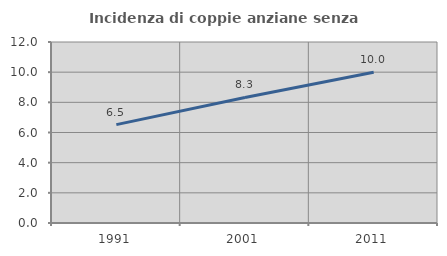
| Category | Incidenza di coppie anziane senza figli  |
|---|---|
| 1991.0 | 6.522 |
| 2001.0 | 8.322 |
| 2011.0 | 10 |